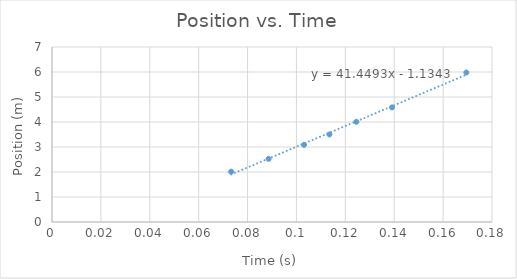
| Category | Position(x) |
|---|---|
| 0.0733 | 2.013 |
| 0.0886 | 2.526 |
| 0.1031 | 3.085 |
| 0.1135 | 3.503 |
| 0.1245 | 4.01 |
| 0.1391 | 4.584 |
| 0.1695 | 5.979 |